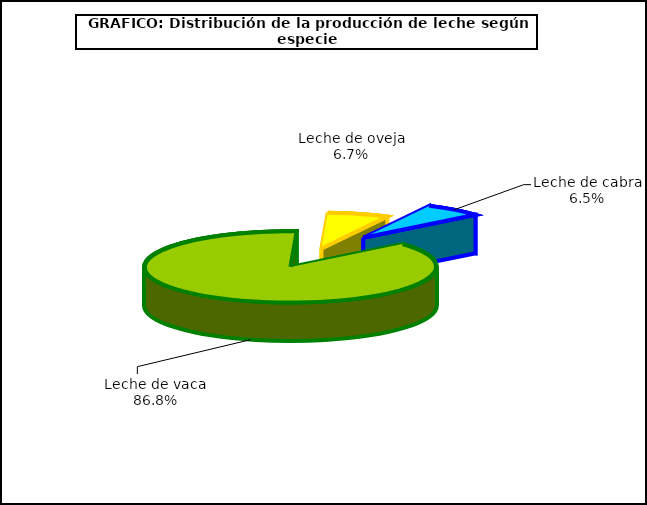
| Category | Leche(según especies) |
|---|---|
| Leche de vaca | 7018.786 |
| Leche de oveja | 544.106 |
| Leche de cabra | 523.662 |